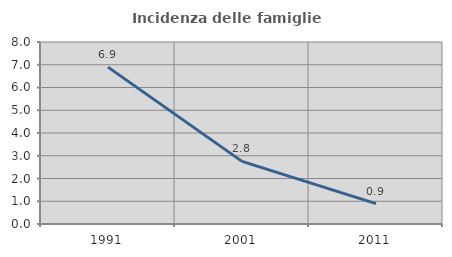
| Category | Incidenza delle famiglie numerose |
|---|---|
| 1991.0 | 6.897 |
| 2001.0 | 2.752 |
| 2011.0 | 0.893 |